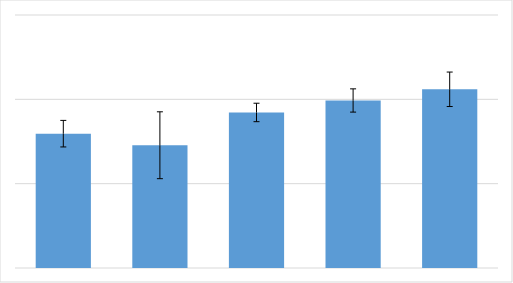
| Category | Series 0 |
|---|---|
| 0 | 0.398 |
| 1 | 0.364 |
| 2 | 0.461 |
| 3 | 0.497 |
| 4 | 0.53 |